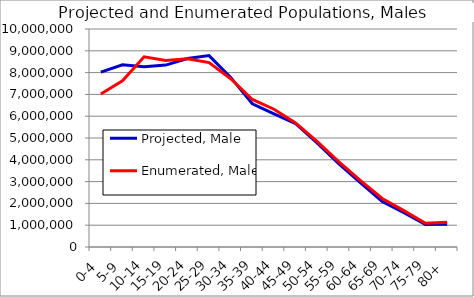
| Category | Projected, Male | Enumerated, Male |
|---|---|---|
| 0-4 | 8023602.68 | 7016987 |
| 5-9 | 8357919.357 | 7624144 |
| 10-14 | 8268591.096 | 8725413 |
| 15-19 | 8344680.374 | 8558868 |
| 20-24 | 8642999.009 | 8630227 |
| 25-29 | 8779812.977 | 8460995 |
| 30-34 | 7780340.377 | 7717657 |
| 35-39 | 6569571.039 | 6766665 |
| 40-44 | 6107911.742 | 6320570 |
| 45-49 | 5655144.513 | 5692013 |
| 50-54 | 4764478.092 | 4834995 |
| 55-59 | 3807071.89 | 3902344 |
| 60-64 | 2945144.014 | 3041034 |
| 65-69 | 2082685.971 | 2224065 |
| 70-74 | 1570776.43 | 1667373 |
| 75-79 | 1037225.33 | 1090518 |
| 80+ | 1040647.515 | 1133122 |